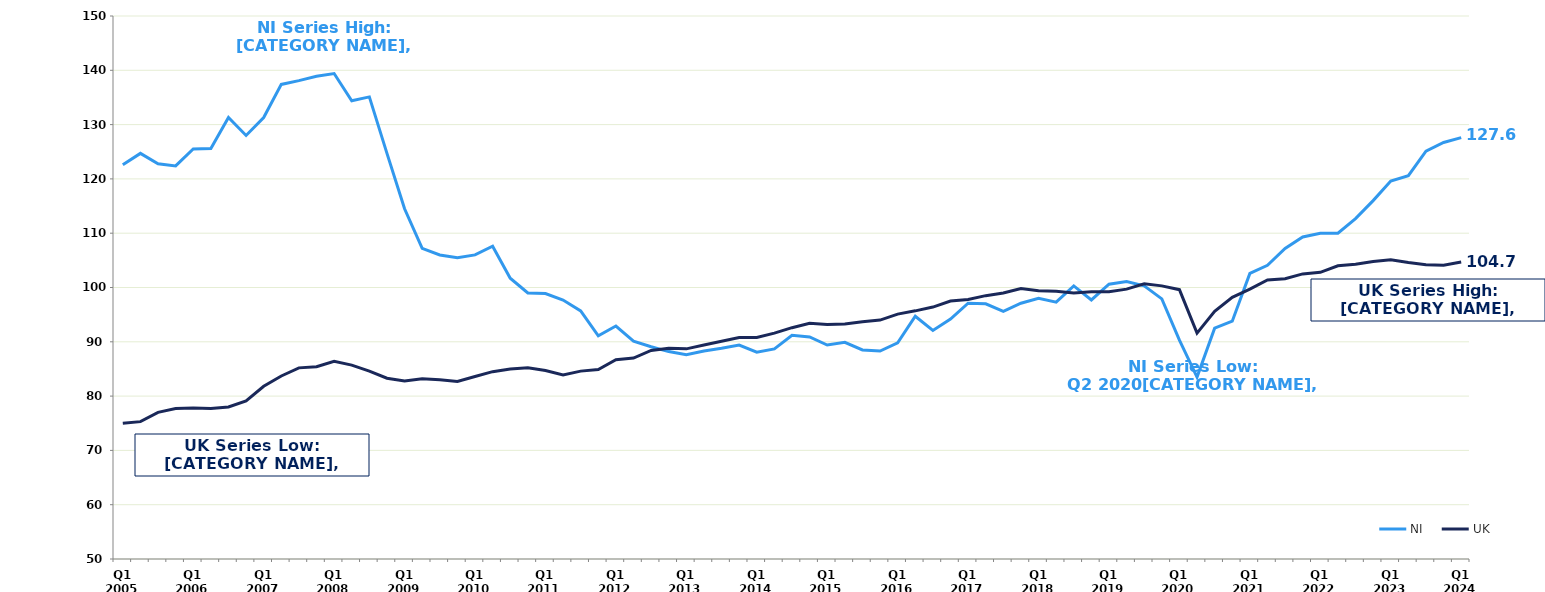
| Category | NI | UK |
|---|---|---|
| Q1 2005 | 122.6 | 75 |
|  | 124.7 | 75.3 |
|  | 122.8 | 77 |
|  | 122.4 | 77.7 |
| Q1 2006 | 125.5 | 77.8 |
|  | 125.6 | 77.7 |
|  | 131.3 | 78 |
|  | 128 | 79.1 |
| Q1 2007 | 131.3 | 81.8 |
|  | 137.4 | 83.7 |
|  | 138.1 | 85.2 |
|  | 138.9 | 85.4 |
| Q1 2008 | 139.4 | 86.4 |
|  | 134.4 | 85.7 |
|  | 135.1 | 84.6 |
|  | 124.7 | 83.3 |
| Q1 2009 | 114.5 | 82.8 |
|  | 107.2 | 83.2 |
|  | 106 | 83 |
|  | 105.5 | 82.7 |
| Q1 2010 | 106 | 83.6 |
|  | 107.6 | 84.5 |
|  | 101.7 | 85 |
|  | 99 | 85.2 |
| Q1 2011 | 98.9 | 84.7 |
|  | 97.7 | 83.9 |
|  | 95.7 | 84.6 |
|  | 91.1 | 84.9 |
| Q1 2012 | 92.9 | 86.7 |
|  | 90.1 | 87 |
|  | 89.1 | 88.4 |
|  | 88.2 | 88.8 |
| Q1 2013 | 87.6 | 88.7 |
|  | 88.3 | 89.4 |
|  | 88.8 | 90.1 |
|  | 89.4 | 90.8 |
| Q1 2014 | 88.1 | 90.8 |
|  | 88.7 | 91.6 |
|  | 91.2 | 92.6 |
|  | 90.9 | 93.4 |
| Q1 2015 | 89.4 | 93.2 |
|  | 89.9 | 93.3 |
|  | 88.5 | 93.7 |
|  | 88.3 | 94 |
| Q1 2016 | 89.8 | 95.1 |
|  | 94.7 | 95.7 |
|  | 92.1 | 96.4 |
|  | 94.2 | 97.5 |
| Q1 2017 | 97.1 | 97.8 |
|  | 97 | 98.5 |
|  | 95.6 | 99 |
|  | 97.1 | 99.8 |
| Q1 2018 | 98 | 99.4 |
|  | 97.3 | 99.3 |
|  | 100.3 | 99 |
|  | 97.7 | 99.2 |
| Q1 2019 | 100.6 | 99.2 |
|  | 101.1 | 99.7 |
|  | 100.3 | 100.7 |
|  | 97.9 | 100.3 |
| Q1 2020 | 90.3 | 99.6 |
|  | 83.5 | 91.6 |
|  | 92.5 | 95.6 |
|  | 93.8 | 98.2 |
| Q1 2021 | 102.6 | 99.7 |
|  | 104.1 | 101.4 |
|  | 107.2 | 101.6 |
|  | 109.3 | 102.5 |
| Q1 2022 | 110 | 102.8 |
|  | 110 | 104 |
|  | 112.7 | 104.3 |
|  | 116 | 104.8 |
| Q1 2023 | 119.6 | 105.1 |
|  | 120.6 | 104.6 |
|  | 125.1 | 104.2 |
|  | 126.7 | 104.1 |
| Q1 2024 | 127.6 | 104.7 |